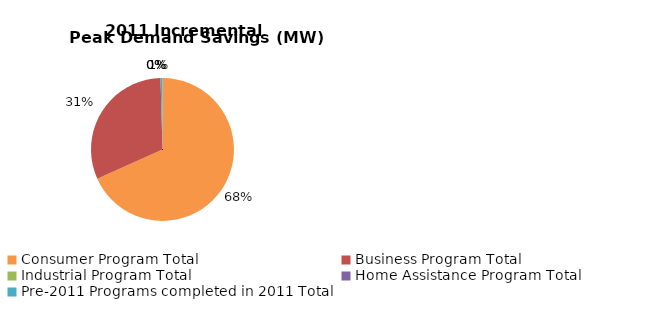
| Category | Incremental Peak Demand Savings (kW) |
|---|---|
| Consumer Program Total | 5.275 |
| Business Program Total | 2.416 |
| Industrial Program Total | 0 |
| Home Assistance Program Total | 0 |
| Pre-2011 Programs completed in 2011 Total | 0.034 |